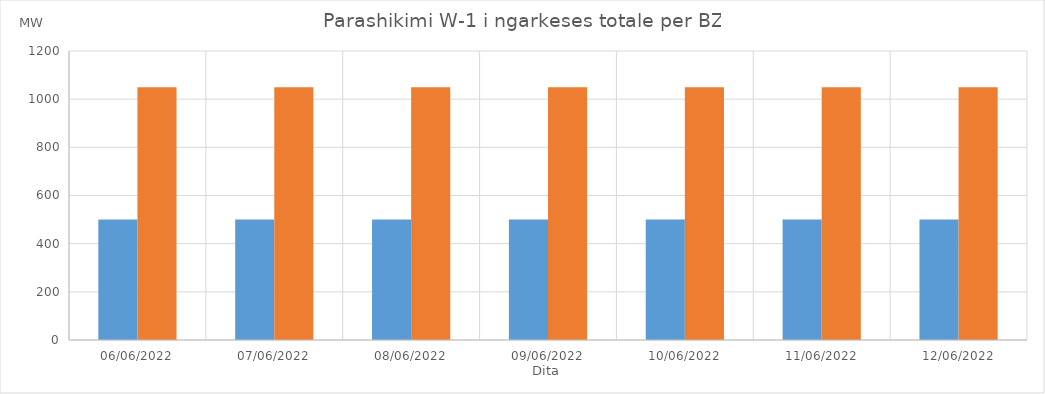
| Category | Min (MW) | Max (MW) |
|---|---|---|
| 06/06/2022 | 500 | 1050 |
| 07/06/2022 | 500 | 1050 |
| 08/06/2022 | 500 | 1050 |
| 09/06/2022 | 500 | 1050 |
| 10/06/2022 | 500 | 1050 |
| 11/06/2022 | 500 | 1050 |
| 12/06/2022 | 500 | 1050 |